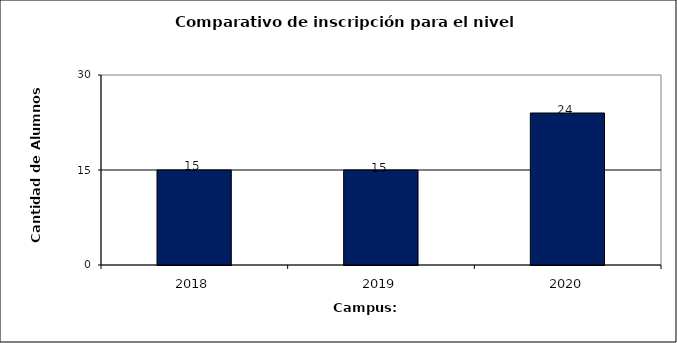
| Category | Series 0 |
|---|---|
| 2018.0 | 15 |
| 2019.0 | 15 |
| 2020.0 | 24 |